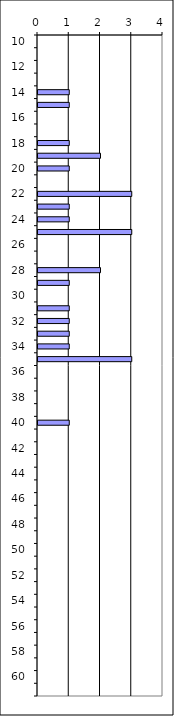
| Category | Series 0 |
|---|---|
| 10.0 | 0 |
| 11.0 | 0 |
| 12.0 | 0 |
| 13.0 | 0 |
| 14.0 | 1 |
| 15.0 | 1 |
| 16.0 | 0 |
| 17.0 | 0 |
| 18.0 | 1 |
| 19.0 | 2 |
| 20.0 | 1 |
| 21.0 | 0 |
| 22.0 | 3 |
| 23.0 | 1 |
| 24.0 | 1 |
| 25.0 | 3 |
| 26.0 | 0 |
| 27.0 | 0 |
| 28.0 | 2 |
| 29.0 | 1 |
| 30.0 | 0 |
| 31.0 | 1 |
| 32.0 | 1 |
| 33.0 | 1 |
| 34.0 | 1 |
| 35.0 | 3 |
| 36.0 | 0 |
| 37.0 | 0 |
| 38.0 | 0 |
| 39.0 | 0 |
| 40.0 | 1 |
| 41.0 | 0 |
| 42.0 | 0 |
| 43.0 | 0 |
| 44.0 | 0 |
| 45.0 | 0 |
| 46.0 | 0 |
| 47.0 | 0 |
| 48.0 | 0 |
| 49.0 | 0 |
| 50.0 | 0 |
| 51.0 | 0 |
| 52.0 | 0 |
| 53.0 | 0 |
| 54.0 | 0 |
| 55.0 | 0 |
| 56.0 | 0 |
| 57.0 | 0 |
| 58.0 | 0 |
| 59.0 | 0 |
| 60.0 | 0 |
| 61.0 | 0 |